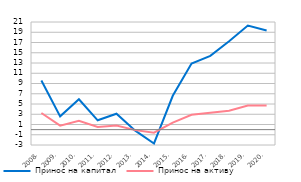
| Category | Принос на капитал | Принос на активу |
|---|---|---|
| 2008. | 9.58 | 3.239 |
| 2009. | 2.59 | 0.782 |
| 2010. | 5.92 | 1.72 |
| 2011. | 1.82 | 0.519 |
| 2012. | 3.1 | 0.8 |
| 2013. | -0.2 | -0.1 |
| 2014. | -2.7 | -0.6 |
| 2015. | 6.6 | 1.38 |
| 2016. | 12.9 | 2.9 |
| 2017. | 14.4 | 3.3 |
| 2018. | 17.23 | 3.7 |
| 2019. | 20.3 | 4.7 |
| 2020. | 19.35 | 4.73 |